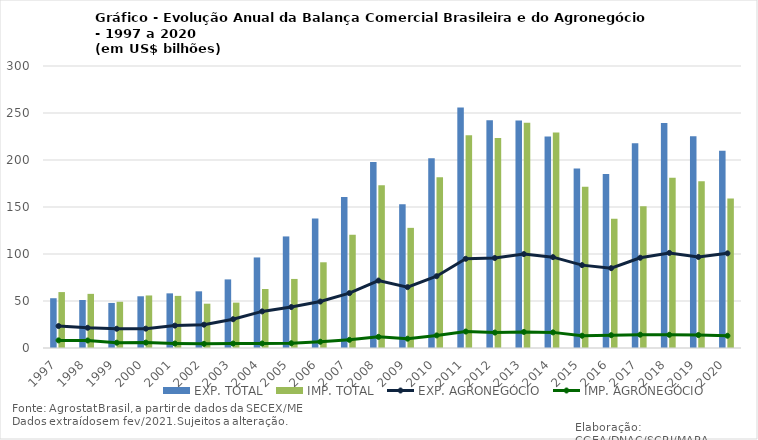
| Category | EXP. TOTAL | IMP. TOTAL |
|---|---|---|
| 1997 | 52.947 | 59.485 |
| 1998 | 51.077 | 57.597 |
| 1999 | 47.946 | 49.182 |
| 2000 | 55.018 | 55.891 |
| 2001 | 58.128 | 55.445 |
| 2002 | 60.29 | 47.14 |
| 2003 | 72.975 | 48.27 |
| 2004 | 96.332 | 62.745 |
| 2005 | 118.693 | 73.468 |
| 2006 | 137.708 | 91.193 |
| 2007 | 160.522 | 120.475 |
| 2008 | 197.779 | 173.119 |
| 2009 | 152.911 | 127.812 |
| 2010 | 201.788 | 181.775 |
| 2011 | 255.936 | 226.244 |
| 2012 | 242.277 | 223.367 |
| 2013 | 241.968 | 239.681 |
| 2014 | 224.974 | 229.128 |
| 2015 | 190.971 | 171.459 |
| 2016 | 185.232 | 137.586 |
| 2017 | 217.739 | 150.749 |
| 2018 | 239.264 | 181.231 |
| 2019 | 225.383 | 177.348 |
| 2020 | 209.878 | 158.937 |